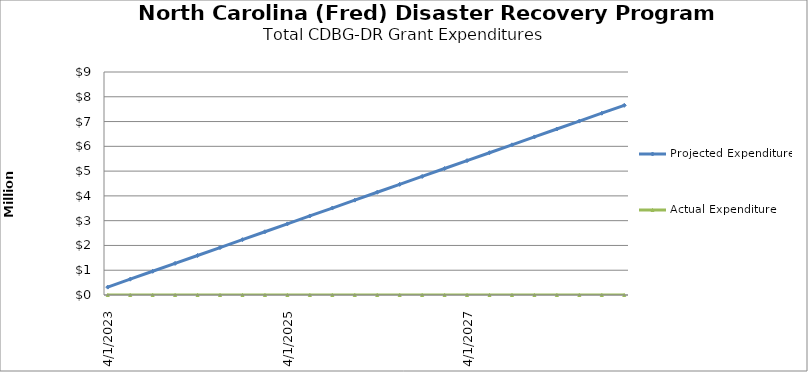
| Category | Projected Expenditures | Actual Expenditure |
|---|---|---|
| 4/1/23 | 319000 | 0 |
| 7/1/23 | 638000 | 0 |
| 10/1/23 | 957000 | 0 |
| 1/1/24 | 1276000 | 0 |
| 4/1/24 | 1595000 | 0 |
| 7/1/24 | 1914000 | 0 |
| 10/1/24 | 2233000 | 0 |
| 1/1/25 | 2552000 | 0 |
| 4/1/25 | 2871000 | 0 |
| 7/1/25 | 3190000 | 0 |
| 10/1/25 | 3509000 | 0 |
| 1/1/26 | 3828000 | 0 |
| 4/1/26 | 4147000 | 0 |
| 7/1/26 | 4466000 | 0 |
| 10/1/26 | 4785000 | 0 |
| 1/1/27 | 5104000 | 0 |
| 4/1/27 | 5423000 | 0 |
| 7/1/27 | 5742000 | 0 |
| 10/1/27 | 6061000 | 0 |
| 1/1/28 | 6380000 | 0 |
| 4/1/28 | 6699000 | 0 |
| 7/1/28 | 7018000 | 0 |
| 10/1/28 | 7337000 | 0 |
| 1/1/29 | 7656000 | 0 |